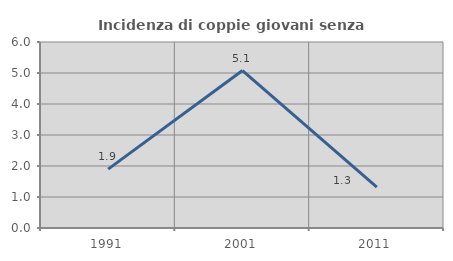
| Category | Incidenza di coppie giovani senza figli |
|---|---|
| 1991.0 | 1.9 |
| 2001.0 | 5.08 |
| 2011.0 | 1.32 |